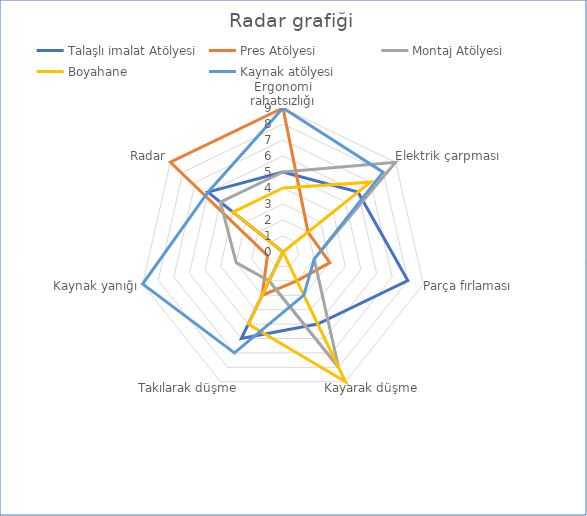
| Category | Talaşlı imalat Atölyesi | Pres Atölyesi | Montaj Atölyesi | Boyahane | Kaynak atölyesi |
|---|---|---|---|---|---|
| Ergonomi rahatsızlığı | 5 | 9 | 5 | 4 | 9 |
| Elektrik çarpması | 6 | 2 | 9 | 7 | 8 |
| Parça fırlaması | 8 | 3 | 2 | 0 | 2 |
| Kayarak düşme | 5 | 2 | 8 | 9 | 3 |
| Takılarak düşme | 6 | 3 | 2 | 5 | 7 |
| Kaynak yanığı | 0 | 1 | 3 | 0 | 9 |
| Radar | 6 | 9 | 5 | 4 | 6 |